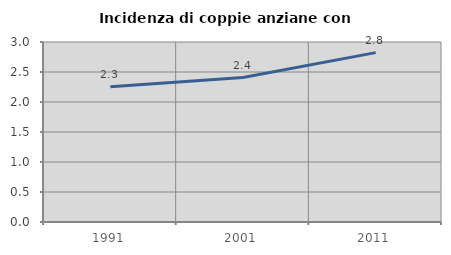
| Category | Incidenza di coppie anziane con figli |
|---|---|
| 1991.0 | 2.256 |
| 2001.0 | 2.408 |
| 2011.0 | 2.823 |